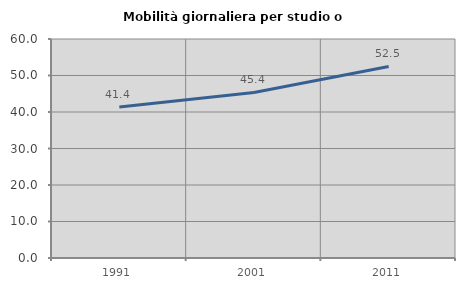
| Category | Mobilità giornaliera per studio o lavoro |
|---|---|
| 1991.0 | 41.39 |
| 2001.0 | 45.364 |
| 2011.0 | 52.471 |